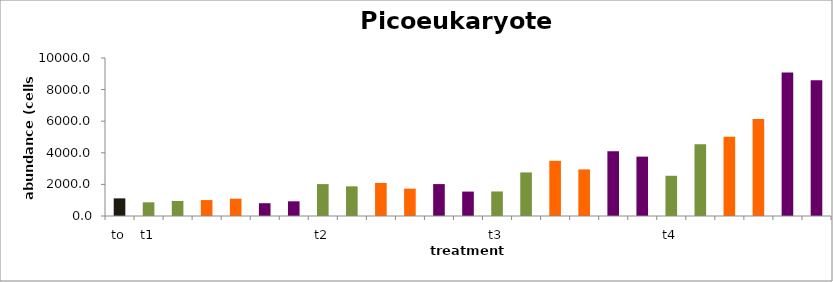
| Category | Series 0 |
|---|---|
| to | 1116.535 |
| t1 | 864.508 |
|  | 950.766 |
|  | 1008.05 |
|  | 1094.39 |
|  | 809.276 |
|  | 929.042 |
| t2 | 2019.287 |
|  | 1877.537 |
|  | 2092.551 |
|  | 1730.833 |
|  | 2020.526 |
|  | 1545.849 |
| t3 | 1553.396 |
|  | 2757.965 |
|  | 3493.444 |
|  | 2949.373 |
|  | 4092.969 |
|  | 3757.669 |
| t4 | 2545.825 |